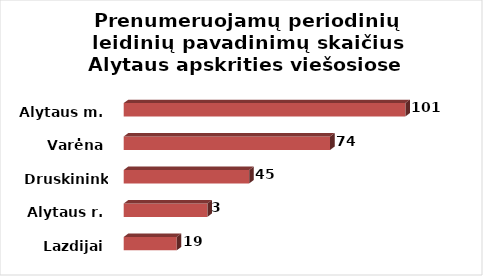
| Category | Series 0 |
|---|---|
| Lazdijai | 19 |
| Alytaus r. | 30 |
| Druskininkai | 45 |
| Varėna | 74 |
| Alytaus m. | 101 |